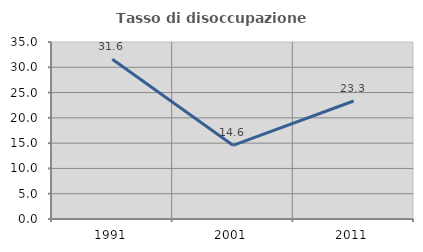
| Category | Tasso di disoccupazione giovanile  |
|---|---|
| 1991.0 | 31.603 |
| 2001.0 | 14.576 |
| 2011.0 | 23.333 |